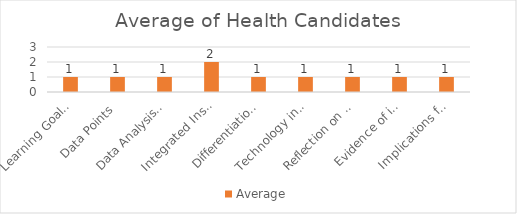
| Category | Average |
|---|---|
| Learning Goals Aligned with Pre-/Post-assessments ACEI 4.0 | 1 |
| Data Points | 1 |
| Data Analysis for Pedagogical Decisions ACEI 4.0 | 1 |
| Integrated Instruction ACEI 3.1 | 2 |
| Differentiation based on knowledge of individual learning ACEI 3.2 | 1 |
| Technology integration | 1 |
| Reflection on pedagogical decisions ACEI 1.0 | 1 |
| Evidence of impact on student learning ACEI 5.1 | 1 |
| Implications for teaching and professional development ACEI 5.1 | 1 |